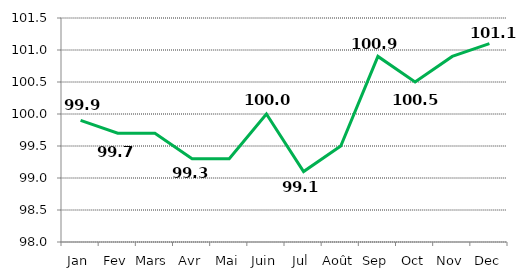
| Category |   INDICE  GENERAL     |
|---|---|
| Jan | 99.9 |
| Fev | 99.7 |
| Mars | 99.7 |
| Avr | 99.3 |
| Mai | 99.3 |
| Juin | 100 |
| Jul | 99.1 |
| Août | 99.5 |
| Sep | 100.9 |
| Oct | 100.5 |
| Nov | 100.9 |
| Dec | 101.1 |